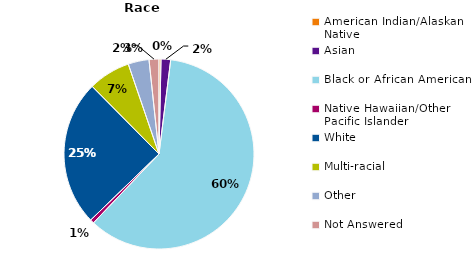
| Category | Series 0 |
|---|---|
| American Indian/Alaskan Native | 0.003 |
| Asian | 0.016 |
| Black or African American | 0.601 |
| Native Hawaiian/Other Pacific Islander | 0.007 |
| White | 0.248 |
| Multi-racial | 0.072 |
| Other | 0.036 |
| Not Answered | 0.017 |